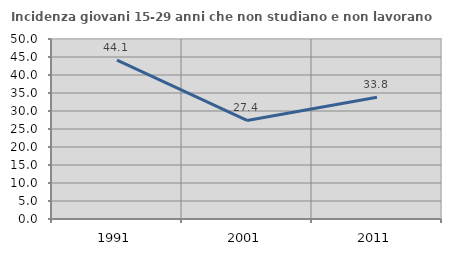
| Category | Incidenza giovani 15-29 anni che non studiano e non lavorano  |
|---|---|
| 1991.0 | 44.118 |
| 2001.0 | 27.387 |
| 2011.0 | 33.809 |